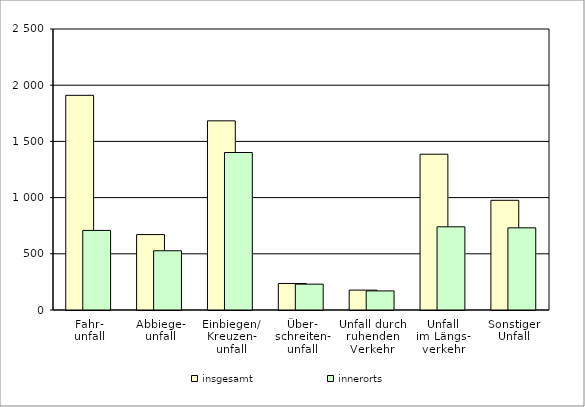
| Category |    insgesamt |    innerorts |
|---|---|---|
| 0 | 1910 | 708 |
| 1 | 671 | 527 |
| 2 | 1683 | 1401 |
| 3 | 236 | 230 |
| 4 | 177 | 170 |
| 5 | 1386 | 740 |
| 6 | 976 | 731 |